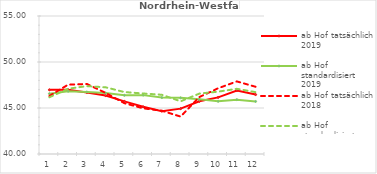
| Category | ab Hof tatsächlich 2019 | ab Hof standardisiert 2019 | ab Hof tatsächlich 2018 | ab Hof standardisiert 2018 |
|---|---|---|---|---|
| 0 | 46.975 | 46.556 | 46.304 | 46.163 |
| 1 | 46.979 | 46.826 | 47.537 | 47.094 |
| 2 | 46.686 | 46.742 | 47.612 | 47.38 |
| 3 | 46.35 | 46.633 | 46.641 | 47.248 |
| 4 | 45.719 | 46.382 | 45.523 | 46.734 |
| 5 | 45.135 | 46.399 | 44.966 | 46.578 |
| 6 | 44.661 | 46.133 | 44.7 | 46.436 |
| 7 | 44.93 | 46.105 | 44.066 | 45.728 |
| 8 | 45.727 | 45.939 | 46.192 | 46.566 |
| 9 | 46.154 | 45.727 | 47.143 | 46.776 |
| 10 | 46.898 | 45.904 | 47.889 | 47.086 |
| 11 | 46.459 | 45.713 | 47.307 | 46.724 |